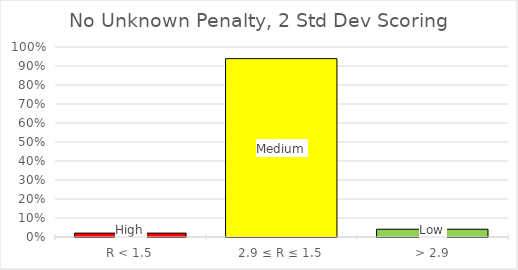
| Category | Frequency |
|---|---|
| R < 1.5 | 0.02 |
| 2.9 ≤ R ≤ 1.5 | 0.939 |
| > 2.9 | 0.041 |